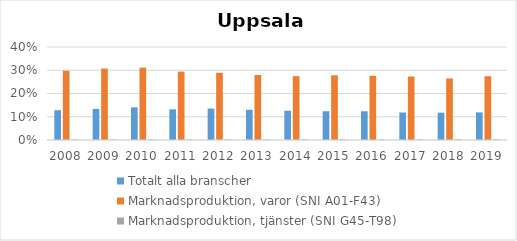
| Category | Totalt alla branscher | Marknadsproduktion, varor (SNI A01-F43) | Marknadsproduktion, tjänster (SNI G45-T98) |
|---|---|---|---|
| 2008 | 0.128 | 0.298 | 0.002 |
| 2009 | 0.134 | 0.307 | 0.002 |
| 2010 | 0.14 | 0.311 | 0.002 |
| 2011 | 0.132 | 0.294 | 0.002 |
| 2012 | 0.135 | 0.289 | 0.002 |
| 2013 | 0.13 | 0.28 | 0.003 |
| 2014 | 0.126 | 0.275 | 0.002 |
| 2015 | 0.124 | 0.278 | 0.003 |
| 2016 | 0.124 | 0.276 | 0.003 |
| 2017 | 0.118 | 0.273 | 0.003 |
| 2018 | 0.118 | 0.265 | 0.003 |
| 2019 | 0.119 | 0.274 | 0.003 |